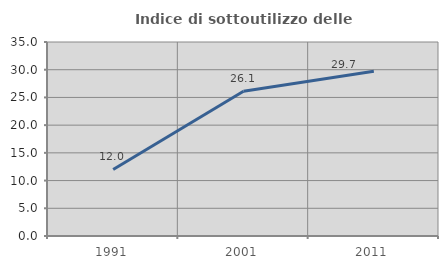
| Category | Indice di sottoutilizzo delle abitazioni  |
|---|---|
| 1991.0 | 12 |
| 2001.0 | 26.126 |
| 2011.0 | 29.74 |